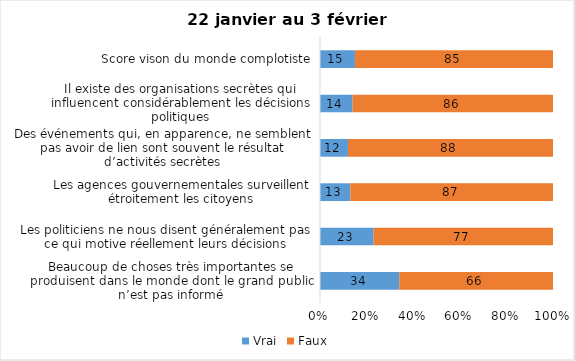
| Category | Vrai | Faux |
|---|---|---|
| Beaucoup de choses très importantes se produisent dans le monde dont le grand public n’est pas informé | 34 | 66 |
| Les politiciens ne nous disent généralement pas ce qui motive réellement leurs décisions | 23 | 77 |
| Les agences gouvernementales surveillent étroitement les citoyens | 13 | 87 |
| Des événements qui, en apparence, ne semblent pas avoir de lien sont souvent le résultat d’activités secrètes | 12 | 88 |
| Il existe des organisations secrètes qui influencent considérablement les décisions politiques | 14 | 86 |
| Score vison du monde complotiste | 15 | 85 |